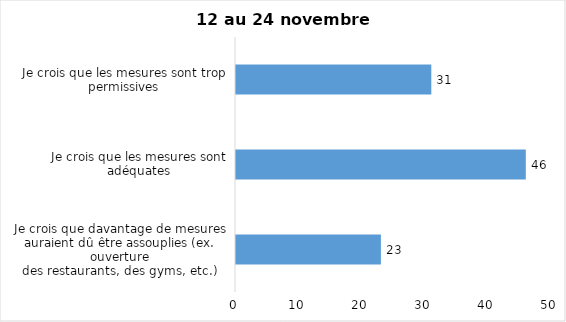
| Category | Series 0 |
|---|---|
| Je crois que davantage de mesures auraient dû être assouplies (ex. ouverture
des restaurants, des gyms, etc.) | 23 |
| Je crois que les mesures sont adéquates | 46 |
| Je crois que les mesures sont trop permissives | 31 |